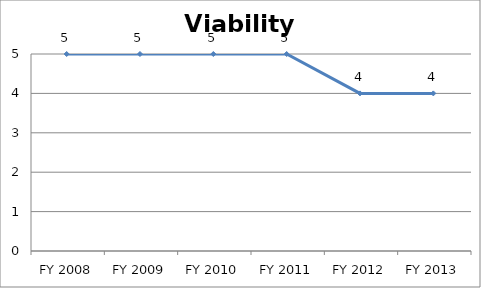
| Category | Viability score |
|---|---|
| FY 2013 | 4 |
| FY 2012 | 4 |
| FY 2011 | 5 |
| FY 2010 | 5 |
| FY 2009 | 5 |
| FY 2008 | 5 |